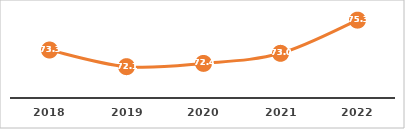
| Category | APROVECHAMIENTO DE LA CAPACIDAD INSTALADA (%) |
|---|---|
| 2018.0 | 73.272 |
| 2019.0 | 72.136 |
| 2020.0 | 72.358 |
| 2021.0 | 73.046 |
| 2022.0 | 75.308 |